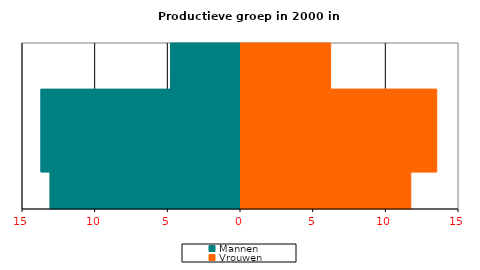
| Category | Mannen | Vrouwen |
|---|---|---|
| 0-5 | -13.101 | 11.751 |
| 5-10 | -13.101 | 11.751 |
| 10-15 | -13.101 | 11.751 |
| 15-20 | -13.101 | 11.751 |
| 20-25 | -13.729 | 13.536 |
| 25-30 | -13.729 | 13.536 |
| 30-35 | -13.729 | 13.536 |
| 35-40 | -13.729 | 13.536 |
| 40-45 | -13.729 | 13.536 |
| 45-50 | -13.729 | 13.536 |
| 50-55 | -13.729 | 13.536 |
| 55-60 | -13.729 | 13.536 |
| 60-65 | -13.729 | 13.536 |
| 65-70 | -4.808 | 6.235 |
| 70-75 | -4.808 | 6.235 |
| 75-80 | -4.808 | 6.235 |
| 80-85 | -4.808 | 6.235 |
| 85-90 | -4.808 | 6.235 |